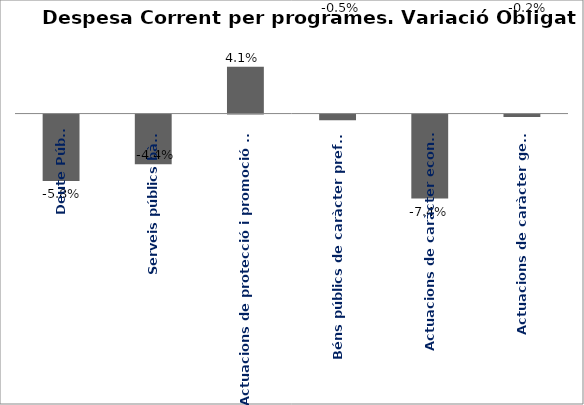
| Category | Series 0 |
|---|---|
| Deute Públic | -0.058 |
| Serveis públics bàsics | -0.044 |
| Actuacions de protecció i promoció social | 0.041 |
| Béns públics de caràcter preferent | -0.005 |
| Actuacions de caràcter econòmic | -0.074 |
| Actuacions de caràcter general | -0.002 |